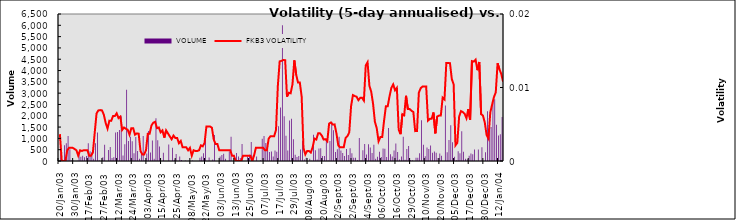
| Category | VOLUME |
|---|---|
| 2003-01-20 | 7 |
| 2003-01-21 | 595 |
| 2003-01-22 | 45 |
| 2003-01-23 | 693 |
| 2003-01-24 | 790 |
| 2003-01-27 | 1108 |
| 2003-01-28 | 515 |
| 2003-01-29 | 20 |
| 2003-01-30 | 13 |
| 2003-02-05 | 2 |
| 2003-02-06 | 12 |
| 2003-02-07 | 368 |
| 2003-02-10 | 193 |
| 2003-02-11 | 227 |
| 2003-02-13 | 165 |
| 2003-02-14 | 220 |
| 2003-02-17 | 784 |
| 2003-02-18 | 432 |
| 2003-02-19 | 385 |
| 2003-02-20 | 95 |
| 2003-02-21 | 790 |
| 2003-02-24 | 1259 |
| 2003-02-25 | 32 |
| 2003-02-26 | 2 |
| 2003-02-27 | 171 |
| 2003-02-28 | 720 |
| 2003-03-03 | 0 |
| 2003-03-05 | 485 |
| 2003-03-06 | 615 |
| 2003-03-07 | 138 |
| 2003-03-10 | 165 |
| 2003-03-11 | 1260 |
| 2003-03-12 | 1282 |
| 2003-03-13 | 1370 |
| 2003-03-14 | 1975 |
| 2003-03-17 | 243 |
| 2003-03-18 | 736 |
| 2003-03-19 | 3155 |
| 2003-03-20 | 882 |
| 2003-03-21 | 1077 |
| 2003-03-24 | 878 |
| 2003-03-25 | 343 |
| 2003-03-26 | 1063 |
| 2003-03-27 | 437 |
| 2003-03-28 | 98 |
| 2003-03-31 | 351 |
| 2003-04-01 | 1100 |
| 2003-04-02 | 32 |
| 2003-04-03 | 335 |
| 2003-04-04 | 1322 |
| 2003-04-07 | 380 |
| 2003-04-08 | 911 |
| 2003-04-09 | 105 |
| 2003-04-10 | 1890 |
| 2003-04-11 | 915 |
| 2003-04-14 | 640 |
| 2003-04-15 | 2 |
| 2003-04-16 | 370 |
| 2003-04-17 | 5 |
| 2003-04-18 | 0 |
| 2003-04-21 | 730 |
| 2003-04-22 | 0 |
| 2003-04-23 | 581 |
| 2003-04-24 | 50 |
| 2003-04-25 | 315 |
| 2003-04-28 | 0 |
| 2003-04-29 | 200 |
| 2003-04-30 | 40 |
| 2003-05-02 | 0 |
| 2003-05-05 | 20 |
| 2003-05-06 | 0 |
| 2003-05-07 | 10 |
| 2003-05-08 | 0 |
| 2003-05-09 | 25 |
| 2003-05-12 | 2 |
| 2003-05-13 | 0 |
| 2003-05-16 | 0 |
| 2003-05-19 | 139 |
| 2003-05-20 | 195 |
| 2003-05-21 | 340 |
| 2003-05-22 | 1043 |
| 2003-05-23 | 0 |
| 2003-05-26 | 160 |
| 2003-05-27 | 0 |
| 2003-05-28 | 68 |
| 2003-05-29 | 1155 |
| 2003-05-30 | 0 |
| 2003-06-02 | 0 |
| 2003-06-03 | 200 |
| 2003-06-04 | 267 |
| 2003-06-05 | 320 |
| 2003-06-06 | 96 |
| 2003-06-09 | 0 |
| 2003-06-10 | 420 |
| 2003-06-11 | 1077 |
| 2003-06-12 | 0 |
| 2003-06-13 | 0 |
| 2003-06-16 | 350 |
| 2003-06-17 | 200 |
| 2003-06-18 | 138 |
| 2003-06-19 | 750 |
| 2003-06-20 | 0 |
| 2003-06-23 | 0 |
| 2003-06-24 | 200 |
| 2003-06-25 | 280 |
| 2003-06-26 | 845 |
| 2003-06-27 | 245 |
| 2003-06-30 | 5 |
| 2003-07-01 | 200 |
| 2003-07-02 | 0 |
| 2003-07-03 | 37 |
| 2003-07-04 | 980 |
| 2003-07-07 | 1110 |
| 2003-07-08 | 791 |
| 2003-07-09 | 700 |
| 2003-07-10 | 401 |
| 2003-07-11 | 423 |
| 2003-07-14 | 202 |
| 2003-07-15 | 469 |
| 2003-07-16 | 411 |
| 2003-07-17 | 1541 |
| 2003-07-18 | 2365 |
| 2003-07-21 | 6001 |
| 2003-07-22 | 1976 |
| 2003-07-23 | 1114 |
| 2003-07-24 | 464 |
| 2003-07-25 | 1790 |
| 2003-07-28 | 1865 |
| 2003-07-29 | 966 |
| 2003-07-30 | 281 |
| 2003-07-31 | 180 |
| 2003-08-01 | 223 |
| 2003-08-04 | 505 |
| 2003-08-05 | 894 |
| 2003-08-06 | 61 |
| 2003-08-07 | 142 |
| 2003-08-08 | 5 |
| 2003-08-11 | 96 |
| 2003-08-12 | 7 |
| 2003-08-13 | 1165 |
| 2003-08-14 | 479 |
| 2003-08-15 | 62 |
| 2003-08-18 | 548 |
| 2003-08-19 | 569 |
| 2003-08-20 | 222 |
| 2003-08-21 | 220 |
| 2003-08-22 | 990 |
| 2003-08-25 | 28 |
| 2003-08-26 | 889 |
| 2003-08-27 | 1733 |
| 2003-08-28 | 1358 |
| 2003-08-29 | 398 |
| 2003-09-02 | 521 |
| 2003-09-03 | 1067 |
| 2003-09-04 | 460 |
| 2003-09-05 | 359 |
| 2003-09-08 | 222 |
| 2003-09-09 | 530 |
| 2003-09-10 | 264 |
| 2003-09-11 | 562 |
| 2003-09-12 | 339 |
| 2003-09-15 | 145 |
| 2003-09-16 | 143 |
| 2003-09-17 | 41 |
| 2003-09-18 | 1015 |
| 2003-09-19 | 25 |
| 2003-09-22 | 470 |
| 2003-09-23 | 757 |
| 2003-09-24 | 291 |
| 2003-09-25 | 744 |
| 2003-09-26 | 595 |
| 2003-09-29 | 350 |
| 2003-09-30 | 715 |
| 2003-10-01 | 94 |
| 2003-10-02 | 187 |
| 2003-10-03 | 409 |
| 2003-10-06 | 176 |
| 2003-10-07 | 549 |
| 2003-10-08 | 547 |
| 2003-10-09 | 179 |
| 2003-10-10 | 1454 |
| 2003-10-13 | 299 |
| 2003-10-14 | 196 |
| 2003-10-15 | 460 |
| 2003-10-16 | 776 |
| 2003-10-17 | 393 |
| 2003-10-20 | 70 |
| 2003-10-21 | 198 |
| 2003-10-22 | 1068 |
| 2003-10-23 | 51 |
| 2003-10-27 | 532 |
| 2003-10-28 | 664 |
| 2003-10-29 | 47 |
| 2003-10-30 | 28 |
| 2003-10-31 | 0 |
| 2003-11-03 | 139 |
| 2003-11-04 | 143 |
| 2003-11-05 | 340 |
| 2003-11-06 | 1805 |
| 2003-11-07 | 718 |
| 2003-11-10 | 211 |
| 2003-11-11 | 602 |
| 2003-11-12 | 533 |
| 2003-11-13 | 687 |
| 2003-11-14 | 370 |
| 2003-11-17 | 418 |
| 2003-11-18 | 360 |
| 2003-11-19 | 132 |
| 2003-11-20 | 330 |
| 2003-11-21 | 235 |
| 2003-11-27 | 1 |
| 2003-11-28 | 2450 |
| 2003-12-01 | 390 |
| 2003-12-02 | 934 |
| 2003-12-03 | 1577 |
| 2003-12-04 | 826 |
| 2003-12-05 | 187 |
| 2003-12-08 | 28 |
| 2003-12-09 | 429 |
| 2003-12-10 | 338 |
| 2003-12-11 | 1319 |
| 2003-12-12 | 409 |
| 2003-12-15 | 102 |
| 2003-12-16 | 72 |
| 2003-12-17 | 227 |
| 2003-12-18 | 337 |
| 2003-12-19 | 293 |
| 2003-12-22 | 503 |
| 2003-12-23 | 10 |
| 2003-12-24 | 511 |
| 2003-12-26 | 0 |
| 2003-12-29 | 610 |
| 2003-12-30 | 0 |
| 2003-12-31 | 386 |
| 2004-01-02 | 2204 |
| 2004-01-05 | 1465 |
| 2004-01-06 | 1498 |
| 2004-01-07 | 2663 |
| 2004-01-08 | 2728 |
| 2004-01-09 | 1600 |
| 2004-01-12 | 1127 |
| 2004-01-13 | 1182 |
| 2004-01-14 | 1946 |